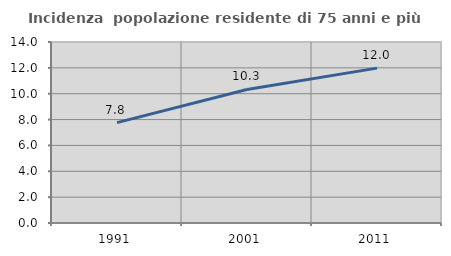
| Category | Incidenza  popolazione residente di 75 anni e più |
|---|---|
| 1991.0 | 7.762 |
| 2001.0 | 10.331 |
| 2011.0 | 11.98 |